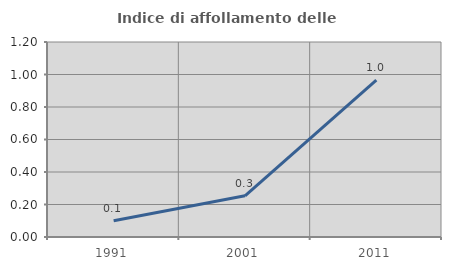
| Category | Indice di affollamento delle abitazioni  |
|---|---|
| 1991.0 | 0.1 |
| 2001.0 | 0.254 |
| 2011.0 | 0.965 |